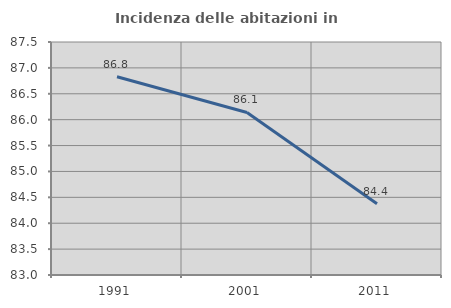
| Category | Incidenza delle abitazioni in proprietà  |
|---|---|
| 1991.0 | 86.829 |
| 2001.0 | 86.139 |
| 2011.0 | 84.378 |